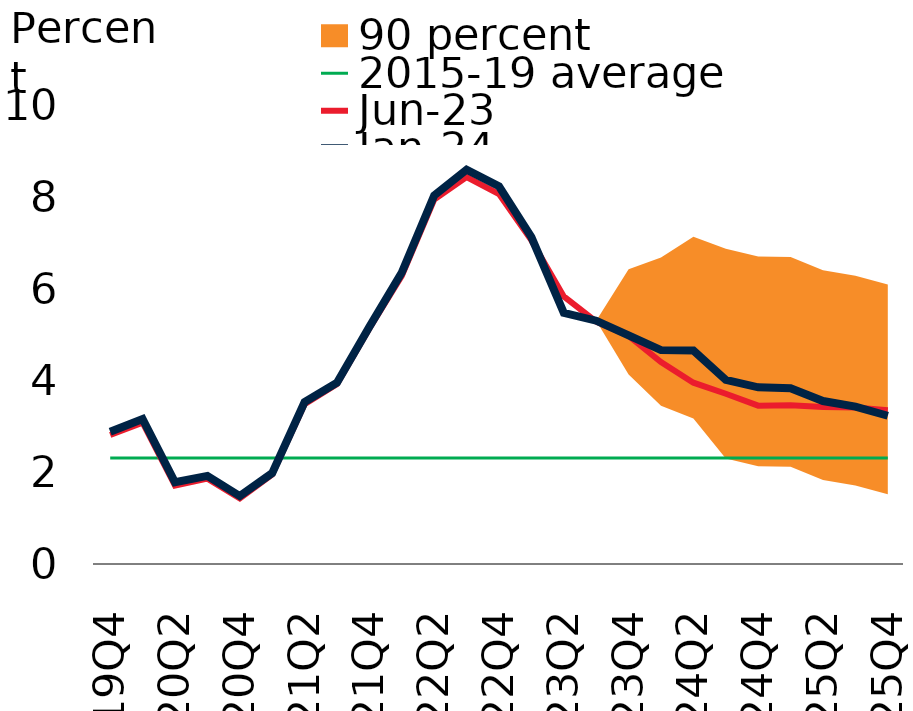
| Category | 2015-19 average | Jun-23 | Jan-24 |
|---|---|---|---|
| 19Q4 | 2.31 | 2.81 | 2.88 |
| 20Q1 | 2.31 | 3.08 | 3.16 |
| 20Q2 | 2.31 | 1.71 | 1.78 |
| 20Q3 | 2.31 | 1.86 | 1.92 |
| 20Q4 | 2.31 | 1.43 | 1.48 |
| 21Q1 | 2.31 | 1.95 | 1.98 |
| 21Q2 | 2.31 | 3.48 | 3.53 |
| 21Q3 | 2.31 | 3.92 | 3.95 |
| 21Q4 | 2.31 | 5.13 | 5.17 |
| 22Q1 | 2.31 | 6.28 | 6.35 |
| 22Q2 | 2.31 | 7.94 | 8.03 |
| 22Q3 | 2.31 | 8.43 | 8.59 |
| 22Q4 | 2.31 | 8.06 | 8.23 |
| 23Q1 | 2.31 | 7.05 | 7.12 |
| 23Q2 | 2.31 | 5.83 | 5.47 |
| 23Q3 | 2.31 | 5.28 | 5.3 |
| 23Q4 | 2.31 | 4.97 | 4.98 |
| 24Q1 | 2.31 | 4.4 | 4.66 |
| 24Q2 | 2.31 | 3.95 | 4.65 |
| 24Q3 | 2.31 | 3.71 | 4.01 |
| 24Q4 | 2.31 | 3.45 | 3.85 |
| 25Q1 | 2.31 | 3.46 | 3.83 |
| 25Q2 | 2.31 | 3.42 | 3.55 |
| 25Q3 | 2.31 | 3.41 | 3.43 |
| 25Q4 | 2.31 | 3.35 | 3.23 |